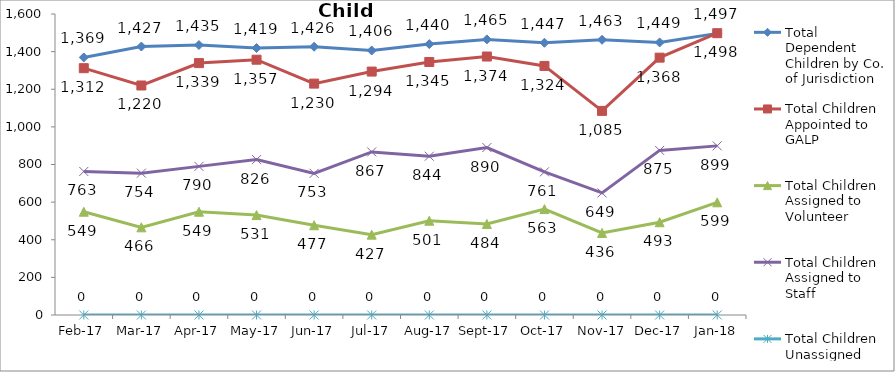
| Category | Total Dependent Children by Co. of Jurisdiction | Total Children Appointed to GALP | Total Children Assigned to Volunteer | Total Children Assigned to Staff | Total Children Unassigned |
|---|---|---|---|---|---|
| 2017-02-01 | 1369 | 1312 | 549 | 763 | 0 |
| 2017-03-01 | 1427 | 1220 | 466 | 754 | 0 |
| 2017-04-01 | 1435 | 1339 | 549 | 790 | 0 |
| 2017-05-01 | 1419 | 1357 | 531 | 826 | 0 |
| 2017-06-01 | 1426 | 1230 | 477 | 753 | 0 |
| 2017-07-01 | 1406 | 1294 | 427 | 867 | 0 |
| 2017-08-01 | 1440 | 1345 | 501 | 844 | 0 |
| 2017-09-01 | 1465 | 1374 | 484 | 890 | 0 |
| 2017-10-01 | 1447 | 1324 | 563 | 761 | 0 |
| 2017-11-01 | 1463 | 1085 | 436 | 649 | 0 |
| 2017-12-01 | 1449 | 1368 | 493 | 875 | 0 |
| 2018-01-01 | 1497 | 1498 | 599 | 899 | 0 |